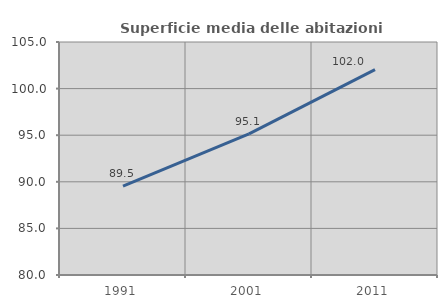
| Category | Superficie media delle abitazioni occupate |
|---|---|
| 1991.0 | 89.541 |
| 2001.0 | 95.137 |
| 2011.0 | 102.028 |